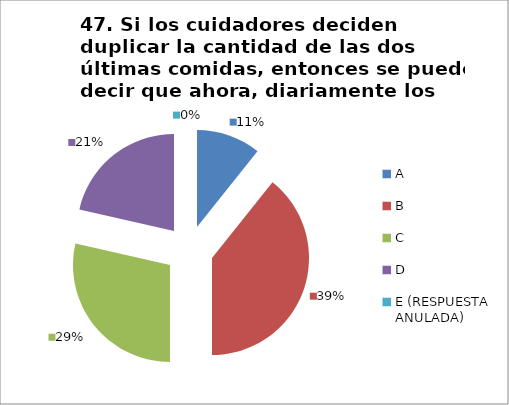
| Category | CANTIDAD DE RESPUESTAS PREGUNTA (47) | PORCENTAJE |
|---|---|---|
| A | 3 | 0.107 |
| B | 11 | 0.393 |
| C | 8 | 0.286 |
| D | 6 | 0.214 |
| E (RESPUESTA ANULADA) | 0 | 0 |